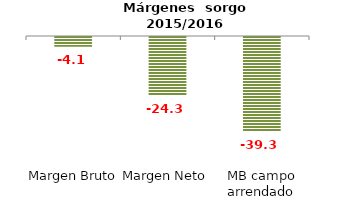
| Category | Series 0 |
|---|---|
| Margen Bruto | -4.081 |
| Margen Neto | -24.291 |
| MB campo arrendado | -39.281 |